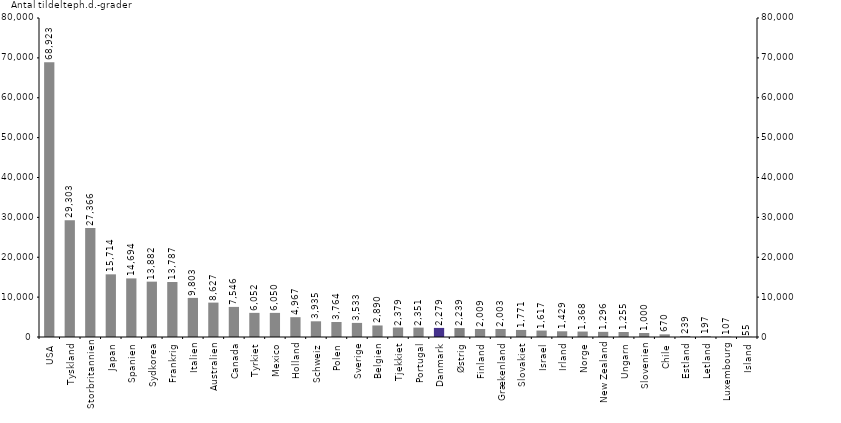
| Category | Antal ph.d-grader |
|---|---|
| USA | 68923 |
| Tyskland | 29303 |
| Storbritannien | 27366 |
| Japan | 15714 |
| Spanien | 14694 |
| Sydkorea | 13882 |
| Frankrig | 13787 |
| Italien | 9803 |
| Australien | 8627 |
| Canada | 7546.12 |
| Tyrkiet | 6052 |
| Mexico | 6050 |
| Holland | 4967 |
| Schweiz | 3935 |
| Polen | 3764 |
| Sverige | 3533 |
| Belgien | 2890 |
| Tjekkiet | 2379 |
| Portugal | 2351 |
| Danmark | 2279 |
| Østrig | 2239 |
| Finland | 2009 |
| Grækenland | 2003 |
| Slovakiet | 1771 |
| Israel | 1617 |
| Irland | 1429 |
| Norge | 1368 |
| New Zealand | 1296 |
| Ungarn | 1255 |
| Slovenien | 1000 |
| Chile | 669.5 |
| Estland | 239 |
| Letland | 197 |
| Luxembourg | 107 |
| Island | 55 |